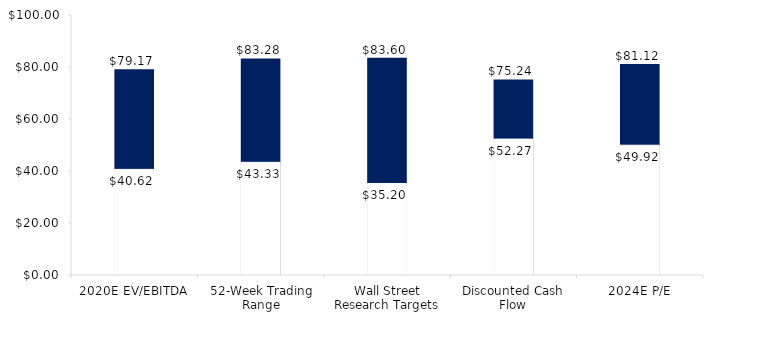
| Category | Series 1 | Series 0 |
|---|---|---|
| 2020E EV/EBITDA | 79.174 | 40.62 |
| 52-Week Trading Range | 83.28 | 43.33 |
| Wall Street Research Targets | 83.6 | 35.2 |
| Discounted Cash Flow | 75.24 | 52.27 |
| 2024E P/E | 81.12 | 49.92 |